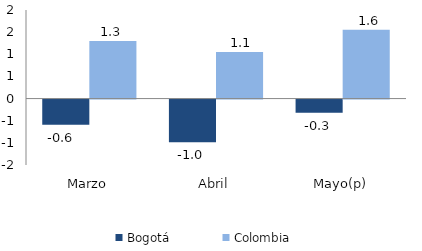
| Category | Bogotá | Colombia |
|---|---|---|
| Marzo | -0.568 | 1.302 |
| Abril | -0.964 | 1.053 |
| Mayo(p) | -0.3 | 1.552 |